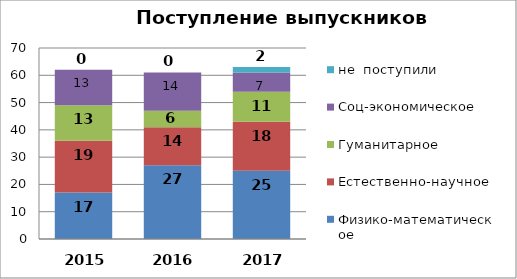
| Category | Физико-математическое | Естественно-научное | Гуманитарное | Соц-экономическое | не  поступили |
|---|---|---|---|---|---|
| 2015.0 | 17 | 19 | 13 | 13 | 0 |
| 2016.0 | 27 | 14 | 6 | 14 | 0 |
| 2017.0 | 25 | 18 | 11 | 7 | 2 |